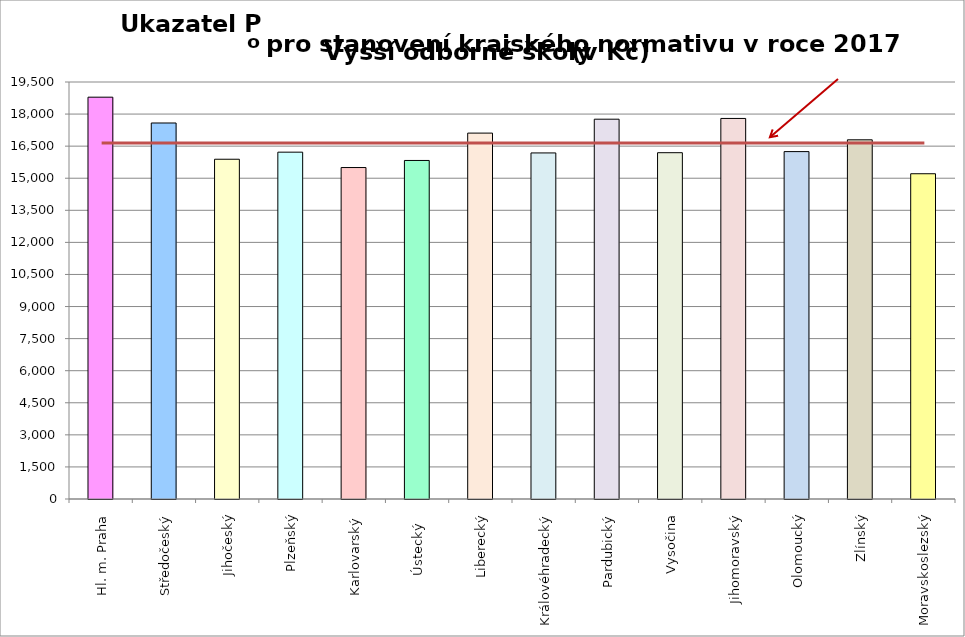
| Category | Series 0 |
|---|---|
| Hl. m. Praha | 18790 |
| Středočeský | 17583.061 |
| Jihočeský | 15888 |
| Plzeňský | 16219 |
| Karlovarský  | 15500 |
| Ústecký   | 15831 |
| Liberecký | 17110 |
| Královéhradecký | 16183 |
| Pardubický | 17761 |
| Vysočina | 16194 |
| Jihomoravský | 17796 |
| Olomoucký | 16245 |
| Zlínský | 16797 |
| Moravskoslezský | 15210 |